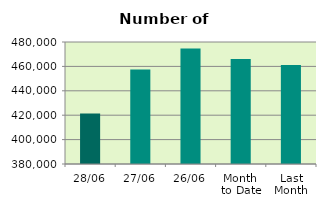
| Category | Series 0 |
|---|---|
| 28/06 | 421380 |
| 27/06 | 457462 |
| 26/06 | 474684 |
| Month 
to Date | 466167.6 |
| Last
Month | 461152.818 |